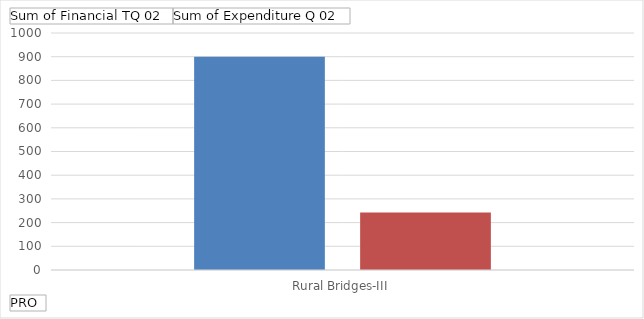
| Category | Sum of Financial TQ 02 | Sum of Expenditure Q 02 |
|---|---|---|
| Rural Bridges-III | 900 | 242.86 |